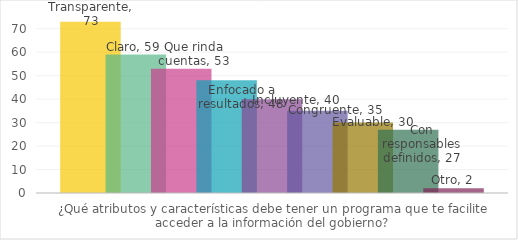
| Category | Transparente | Claro | Que rinda cuentas | Enfocado a resultados | Incluyente | Congruente | Evaluable | Con responsables definidos | Otro |
|---|---|---|---|---|---|---|---|---|---|
| ¿Qué atributos y características debe tener un programa que te facilite acceder a la información del gobierno? | 73 | 59 | 53 | 48 | 40 | 35 | 30 | 27 | 2 |